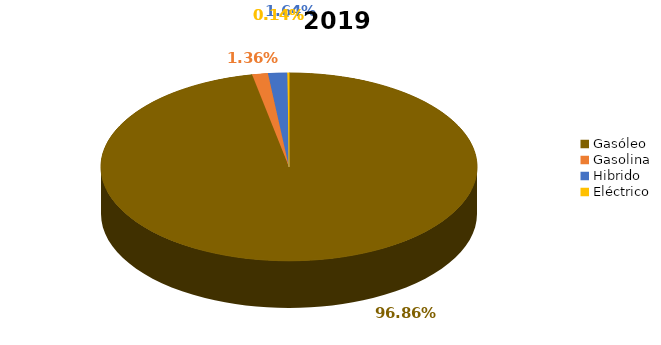
| Category | Series 0 |
|---|---|
| Gasóleo | 0.969 |
| Gasolina | 0.014 |
| Hibrido | 0.016 |
| Eléctrico | 0.001 |